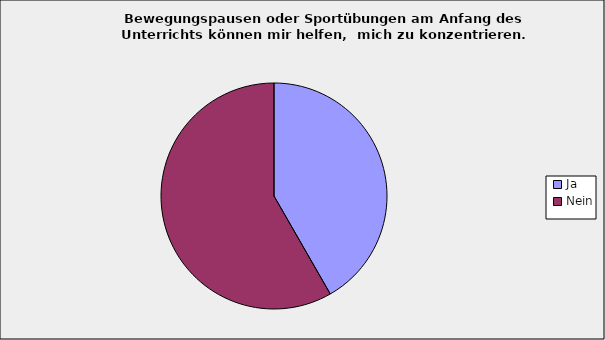
| Category | Series 0 |
|---|---|
| Ja | 0.417 |
| Nein | 0.583 |